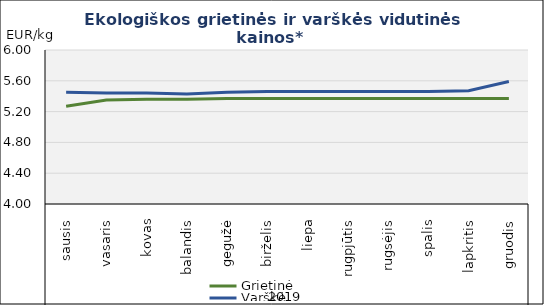
| Category | Grietinė | Varškė |
|---|---|---|
| 0 | 5.27 | 5.45 |
| 1 | 5.35 | 5.44 |
| 2 | 5.36 | 5.44 |
| 3 | 5.36 | 5.43 |
| 4 | 5.37 | 5.45 |
| 5 | 5.37 | 5.46 |
| 6 | 5.37 | 5.46 |
| 7 | 5.37 | 5.46 |
| 8 | 5.37 | 5.46 |
| 9 | 5.37 | 5.46 |
| 10 | 5.37 | 5.47 |
| 11 | 5.37 | 5.59 |